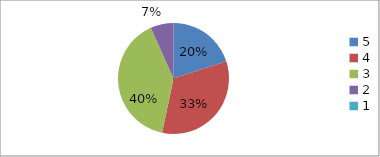
| Category | Series 0 | Series 1 |
|---|---|---|
| 5.0 | 20 | 20 |
| 4.0 | 33.3 | 33.3 |
| 3.0 | 40 | 40 |
| 2.0 | 6.7 | 6.7 |
| 1.0 | 0 | 0 |